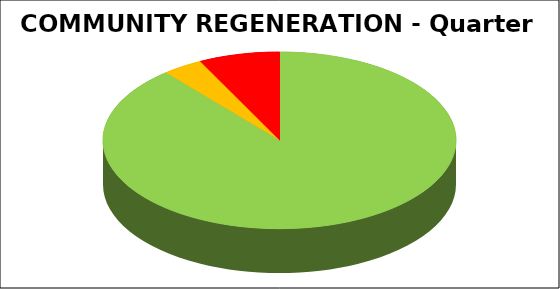
| Category | Series 0 |
|---|---|
| Green | 0.889 |
| Amber | 0.037 |
| Red | 0.074 |